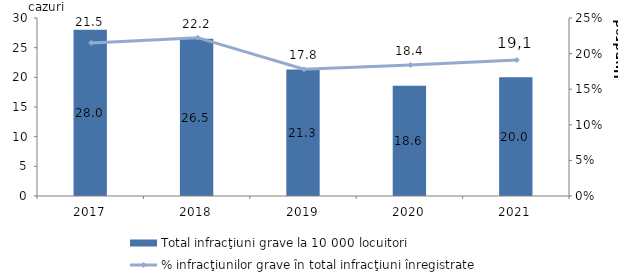
| Category | Total infracţiuni grave la 10 000 locuitori  |
|---|---|
| 2017.0 | 28 |
| 2018.0 | 26.5 |
| 2019.0 | 21.3 |
| 2020.0 | 18.6 |
| 2021.0 | 20 |